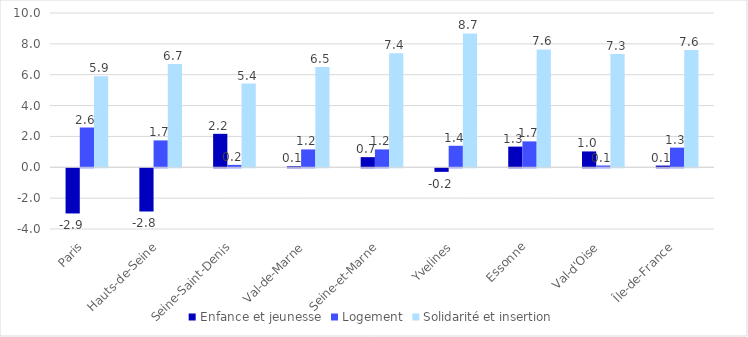
| Category | Enfance et jeunesse | Logement | Solidarité et insertion |
|---|---|---|---|
| Paris | -2.928 | 2.578 | 5.902 |
| Hauts-de-Seine | -2.801 | 1.742 | 6.69 |
| Seine-Saint-Denis | 2.169 | 0.156 | 5.429 |
| Val-de-Marne | 0.067 | 1.158 | 6.507 |
| Seine-et-Marne | 0.658 | 1.159 | 7.384 |
| Yvelines | -0.232 | 1.394 | 8.674 |
| Essonne | 1.339 | 1.679 | 7.64 |
| Val-d'Oise | 1.027 | 0.115 | 7.347 |
| Île-de-France | 0.111 | 1.274 | 7.602 |